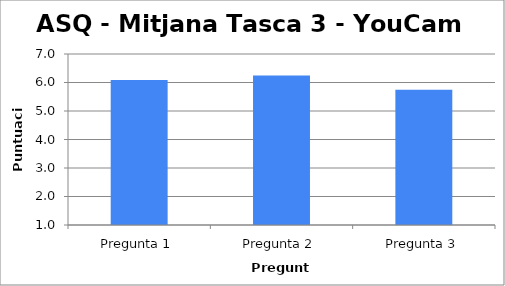
| Category | Series 0 |
|---|---|
| Pregunta 1 | 6.083 |
| Pregunta 2 | 6.25 |
| Pregunta 3 | 5.75 |